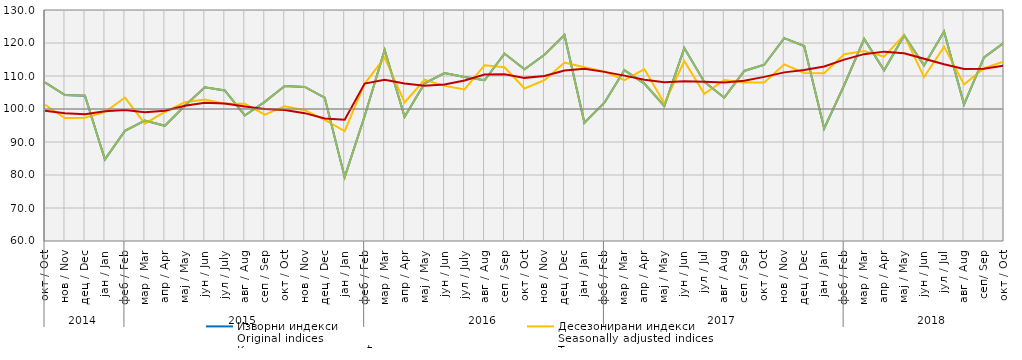
| Category | Изворни индекси
Original indices | Десезонирани индекси
Seasonally adjusted indices | Календарски прилагођени индекси
Working-day adjusted indices | Тренд
Trend |
|---|---|---|---|---|
| 0 | 108.074 | 101.276 | 108.074 | 99.464 |
| 1 | 104.242 | 97.279 | 104.242 | 98.683 |
| 2 | 104.032 | 97.354 | 104.032 | 98.417 |
| 3 | 84.716 | 99.051 | 84.716 | 99.345 |
| 4 | 93.365 | 103.474 | 93.365 | 99.683 |
| 5 | 96.491 | 95.544 | 96.491 | 99 |
| 6 | 94.914 | 99.097 | 94.914 | 99.445 |
| 7 | 101.001 | 102.057 | 101.001 | 101.011 |
| 8 | 106.571 | 102.84 | 106.571 | 101.901 |
| 9 | 105.634 | 101.599 | 105.634 | 101.648 |
| 10 | 98.032 | 101.598 | 98.032 | 100.775 |
| 11 | 102.175 | 98.308 | 102.175 | 100.031 |
| 12 | 106.973 | 100.791 | 106.973 | 99.69 |
| 13 | 106.679 | 99.636 | 106.679 | 98.746 |
| 14 | 103.448 | 96.675 | 103.448 | 97.1 |
| 15 | 79.358 | 93.304 | 79.358 | 96.757 |
| 16 | 97.898 | 107.698 | 97.898 | 107.695 |
| 17 | 117.913 | 115.541 | 117.913 | 108.865 |
| 18 | 97.629 | 102.029 | 97.629 | 107.704 |
| 19 | 107.793 | 108.862 | 107.793 | 107.063 |
| 20 | 110.869 | 107.006 | 110.869 | 107.435 |
| 21 | 109.684 | 105.949 | 109.684 | 108.661 |
| 22 | 108.719 | 113.279 | 108.719 | 110.434 |
| 23 | 116.799 | 112.656 | 116.799 | 110.524 |
| 24 | 112.011 | 106.223 | 112.011 | 109.434 |
| 25 | 116.451 | 108.745 | 116.451 | 109.985 |
| 26 | 122.432 | 114.058 | 122.432 | 111.681 |
| 27 | 95.812 | 112.645 | 95.812 | 112.162 |
| 28 | 101.907 | 111.388 | 101.907 | 111.251 |
| 29 | 111.746 | 108.757 | 111.746 | 110.116 |
| 30 | 107.7 | 112.111 | 107.7 | 108.863 |
| 31 | 100.901 | 101.69 | 100.901 | 108.117 |
| 32 | 118.466 | 114.487 | 118.466 | 108.399 |
| 33 | 108.212 | 104.58 | 108.212 | 108.23 |
| 34 | 103.433 | 108.813 | 103.433 | 108.055 |
| 35 | 111.521 | 108.035 | 111.521 | 108.568 |
| 36 | 113.414 | 108.029 | 113.414 | 109.734 |
| 37 | 121.479 | 113.538 | 121.479 | 111.1 |
| 38 | 119.1 | 110.918 | 119.1 | 111.804 |
| 39 | 94.101 | 110.843 | 94.101 | 112.897 |
| 40 | 107.2 | 116.611 | 107.218 | 114.97 |
| 41 | 121.246 | 117.54 | 121.246 | 116.626 |
| 42 | 111.733 | 115.843 | 111.733 | 117.385 |
| 43 | 122.3 | 122.427 | 122.305 | 116.896 |
| 44 | 113.2 | 109.676 | 113.217 | 115.215 |
| 45 | 123.5 | 118.902 | 123.46 | 113.545 |
| 46 | 101.4 | 107.422 | 101.443 | 112.144 |
| 47 | 115.615 | 112.346 | 115.615 | 112.167 |
| 48 | 120.093 | 114.411 | 120.093 | 113.163 |